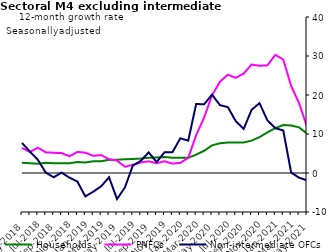
| Category | zero | Households | PNFCs | Non-intermediate OFCs |
|---|---|---|---|---|
| May-2018 | 0 | 2.6 | 6.4 | 7.7 |
| Jun-2018 | 0 | 2.5 | 5.4 | 5.5 |
| Jul-2018 | 0 | 2.4 | 6.5 | 3.4 |
| Aug-2018 | 0 | 2.6 | 5.3 | 0.1 |
| Sep-2018 | 0 | 2.5 | 5.2 | -1.1 |
| Oct-2018 | 0 | 2.5 | 5.1 | 0.1 |
| Nov-2018 | 0 | 2.5 | 4.3 | -1.2 |
| Dec-2018 | 0 | 2.8 | 5.4 | -2.2 |
| Jan-2019 | 0 | 2.7 | 5.2 | -6 |
| Feb-2019 | 0 | 3 | 4.4 | -4.8 |
| Mar-2019 | 0 | 3 | 4.6 | -3.4 |
| Apr-2019 | 0 | 3.4 | 3.5 | -1.1 |
| May-2019 | 0 | 3.4 | 3.2 | -6.7 |
| Jun-2019 | 0 | 3.5 | 1.6 | -3.7 |
| Jul-2019 | 0 | 3.6 | 2.1 | 1.9 |
| Aug-2019 | 0 | 3.7 | 2.7 | 3.1 |
| Sep-2019 | 0 | 3.9 | 3 | 5.3 |
| Oct-2019 | 0 | 4 | 2.5 | 2.8 |
| Nov-2019 | 0 | 4.1 | 3 | 5.3 |
| Dec-2019 | 0 | 3.9 | 2.4 | 5.3 |
| Jan-2020 | 0 | 3.9 | 2.6 | 8.9 |
| Feb-2020 | 0 | 3.9 | 3.9 | 8.3 |
| Mar-2020 | 0 | 4.7 | 9.7 | 17.7 |
| Apr-2020 | 0 | 5.7 | 14.2 | 17.6 |
| May-2020 | 0 | 7.1 | 19.9 | 20.1 |
| Jun-2020 | 0 | 7.6 | 23.4 | 17.4 |
| Jul-2020 | 0 | 7.8 | 25.2 | 16.9 |
| Aug-2020 | 0 | 7.8 | 24.4 | 13.3 |
| Sep-2020 | 0 | 7.8 | 25.5 | 11.3 |
| Oct-2020 | 0 | 8.3 | 27.8 | 16.2 |
| Nov-2020 | 0 | 9.2 | 27.5 | 17.9 |
| Dec-2020 | 0 | 10.4 | 27.6 | 13.5 |
| Jan-2021 | 0 | 11.5 | 30.3 | 11.5 |
| Feb-2021 | 0 | 12.3 | 29.1 | 10.9 |
| Mar-2021 | 0 | 12.2 | 22.3 | 0.1 |
| Apr-2021 | 0 | 11.7 | 17.9 | -1.2 |
| May-2021 | 0 | 10.1 | 11.9 | -1.9 |